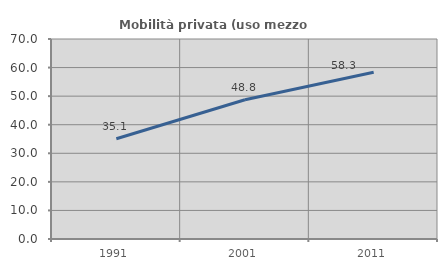
| Category | Mobilità privata (uso mezzo privato) |
|---|---|
| 1991.0 | 35.07 |
| 2001.0 | 48.758 |
| 2011.0 | 58.333 |